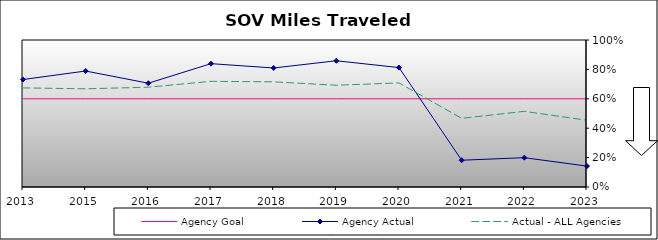
| Category | Agency Goal | Agency Actual | Actual - ALL Agencies |
|---|---|---|---|
| 2013.0 | 0.6 | 0.731 | 0.674 |
| 2015.0 | 0.6 | 0.789 | 0.668 |
| 2016.0 | 0.6 | 0.706 | 0.679 |
| 2017.0 | 0.6 | 0.839 | 0.719 |
| 2018.0 | 0.6 | 0.81 | 0.715 |
| 2019.0 | 0.6 | 0.859 | 0.692 |
| 2020.0 | 0.6 | 0.812 | 0.708 |
| 2021.0 | 0.6 | 0.182 | 0.467 |
| 2022.0 | 0.6 | 0.2 | 0.515 |
| 2023.0 | 0.6 | 0.142 | 0.454 |